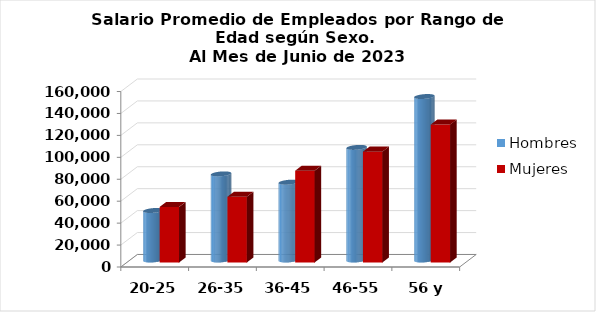
| Category | Hombres | Mujeres |
|---|---|---|
| 20-25 | 45154.545 | 50711.316 |
| 26-35 | 78524.25 | 59974.126 |
| 36-45 | 70955.543 | 83739.706 |
| 46-55 | 102677.083 | 101097.957 |
| 56 y más | 149061.875 | 125767.224 |